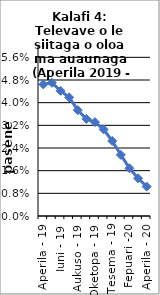
| Category | All items - 12 month rolling year average changes |
|---|---|
| Aperila - 19 | 0.046 |
| Me - 19 | 0.047 |
| Iuni - 19 | 0.044 |
| Iulai - 19 | 0.042 |
| Aukuso - 19 | 0.037 |
| Setema - 19 | 0.034 |
| Oketopa - 19 | 0.033 |
| Novema - 19 | 0.031 |
| Tesema - 19 | 0.026 |
| Ianuari - 20 | 0.022 |
| Fepuari -20 | 0.017 |
| Mati -20 | 0.013 |
| Aperila - 20 | 0.01 |